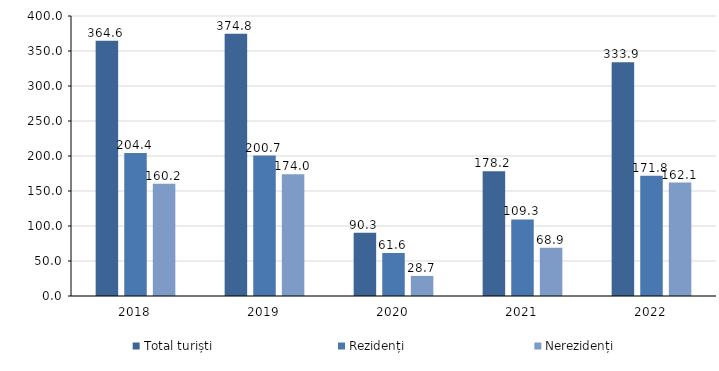
| Category | Total turiști | Rezidenți  | Nerezidenți  |
|---|---|---|---|
| 2018.0 | 364.6 | 204.4 | 160.2 |
| 2019.0 | 374.8 | 200.7 | 174 |
| 2020.0 | 90.3 | 61.6 | 28.7 |
| 2021.0 | 178.2 | 109.3 | 68.9 |
| 2022.0 | 333.9 | 171.8 | 162.1 |